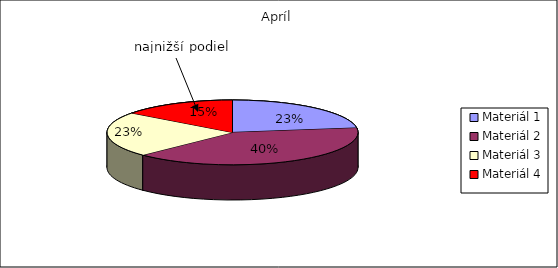
| Category | Apríl |
|---|---|
| Materiál 1 | 800 |
| Materiál 2 | 1400 |
| Materiál 3 | 790 |
| Materiál 4 | 520 |